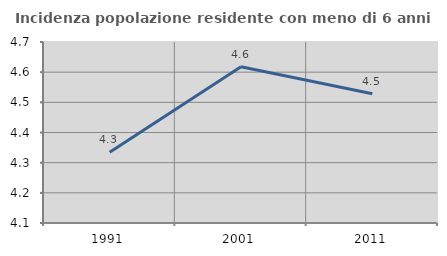
| Category | Incidenza popolazione residente con meno di 6 anni |
|---|---|
| 1991.0 | 4.335 |
| 2001.0 | 4.618 |
| 2011.0 | 4.528 |